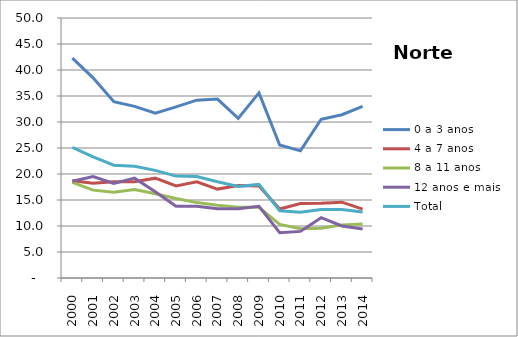
| Category | 0 a 3 anos | 4 a 7 anos | 8 a 11 anos | 12 anos e mais | Total |
|---|---|---|---|---|---|
| 2000.0 | 42.3 | 18.7 | 18.4 | 18.6 | 25.1 |
| 2001.0 | 38.5 | 18.2 | 16.9 | 19.5 | 23.3 |
| 2002.0 | 33.9 | 18.5 | 16.5 | 18.2 | 21.7 |
| 2003.0 | 33 | 18.5 | 17 | 19.2 | 21.5 |
| 2004.0 | 31.7 | 19.2 | 16.2 | 16.6 | 20.7 |
| 2005.0 | 32.9 | 17.7 | 15.3 | 13.8 | 19.6 |
| 2006.0 | 34.2 | 18.5 | 14.5 | 13.8 | 19.5 |
| 2007.0 | 34.4 | 17.1 | 14 | 13.3 | 18.5 |
| 2008.0 | 30.7 | 17.8 | 13.6 | 13.3 | 17.6 |
| 2009.0 | 35.6 | 17.7 | 13.6 | 13.8 | 18 |
| 2010.0 | 25.576 | 13.274 | 10.299 | 8.703 | 12.937 |
| 2011.0 | 24.453 | 14.318 | 9.463 | 8.964 | 12.654 |
| 2012.0 | 30.533 | 14.363 | 9.565 | 11.59 | 13.179 |
| 2013.0 | 31.399 | 14.587 | 10.216 | 10.008 | 13.167 |
| 2014.0 | 33.007 | 13.245 | 10.378 | 9.418 | 12.68 |